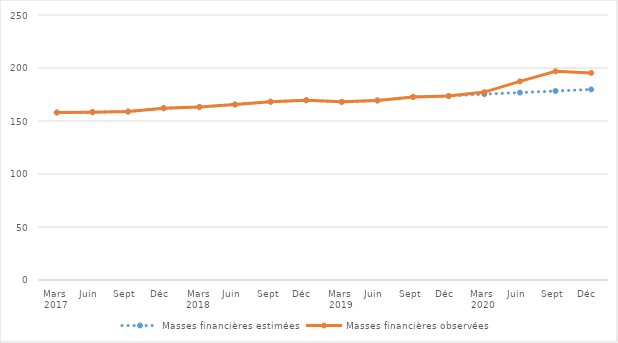
| Category | Masses financières estimées | Masses financières observées  |
|---|---|---|
| 0 | 157.98 | 157.98 |
| 1 | 158.32 | 158.32 |
| 2 | 158.902 | 158.902 |
| 3 | 162.097 | 162.097 |
| 4 | 163.226 | 163.226 |
| 5 | 165.611 | 165.611 |
| 6 | 168.19 | 168.19 |
| 7 | 169.563 | 169.563 |
| 8 | 168.059 | 168.059 |
| 9 | 169.384 | 169.384 |
| 10 | 172.721 | 172.721 |
| 11 | 173.595 | 173.595 |
| 12 | 175.321 | 177.268 |
| 13 | 176.811 | 187.398 |
| 14 | 178.301 | 196.88 |
| 15 | 179.792 | 195.375 |